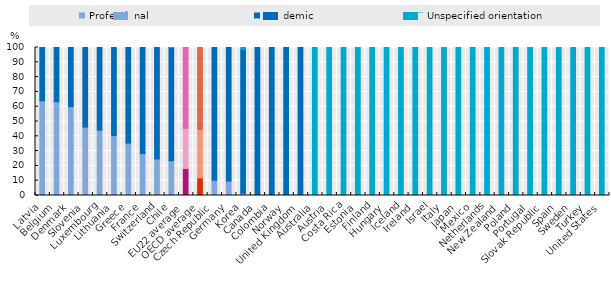
| Category | Professional | Academic | Unspecified orientation |
|---|---|---|---|
| Latvia | 64.028 | 35.972 | 0 |
| Belgium | 63.422 | 36.578 | 0 |
| Denmark | 60.075 | 39.925 | 0 |
| Slovenia | 46.202 | 53.798 | 0 |
| Luxembourg | 44.197 | 55.803 | 0 |
| Lithuania | 40.472 | 59.528 | 0 |
| Greece | 35.4 | 64.6 | 0 |
| France | 28.302 | 71.698 | 0 |
| Switzerland | 24.696 | 75.304 | 0 |
| Chile | 23.486 | 76.514 | 0 |
| EU22 average | 18.277 | 27.178 | 54.545 |
| OECD average | 11.889 | 32.813 | 55.298 |
| Czech Republic | 10.269 | 89.731 | 0 |
| Germany | 9.715 | 90.285 | 0 |
| Korea | 1.534 | 97.145 | 1.321 |
| Canada | 0 | 100 | 0 |
| Colombia | 0 | 100 | 0 |
| Norway | 0 | 100 | 0 |
| United Kingdom | 0 | 100 | 0 |
| Australia | 0 | 0 | 100 |
| Austria | 0 | 0 | 100 |
| Costa Rica | 0 | 0 | 100 |
| Estonia | 0 | 0 | 100 |
| Finland | 0 | 0 | 100 |
| Hungary | 0 | 0 | 100 |
| Iceland | 0 | 0 | 100 |
| Ireland | 0 | 0 | 100 |
| Israel | 0 | 0 | 100 |
| Italy | 0 | 0 | 100 |
| Japan | 0 | 0 | 100 |
| Mexico | 0 | 0 | 100 |
| Netherlands | 0 | 0 | 100 |
| New Zealand | 0 | 0 | 100 |
| Poland | 0 | 0 | 100 |
| Portugal | 0 | 0 | 100 |
| Slovak Republic | 0 | 0 | 100 |
| Spain | 0 | 0 | 100 |
| Sweden | 0 | 0 | 100 |
| Turkey | 0 | 0 | 100 |
| United States | 0 | 0 | 100 |